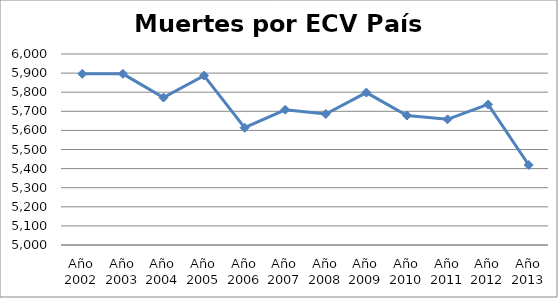
| Category | Series 0 |
|---|---|
| Año 2002 | 5896 |
| Año 2003 | 5896 |
| Año 2004 | 5772 |
| Año 2005 | 5887 |
| Año 2006 | 5614 |
| Año 2007 | 5708 |
| Año 2008 | 5686 |
| Año 2009 | 5798 |
| Año 2010 | 5678 |
| Año 2011 | 5658 |
| Año 2012 | 5736 |
| Año 2013 | 5419 |